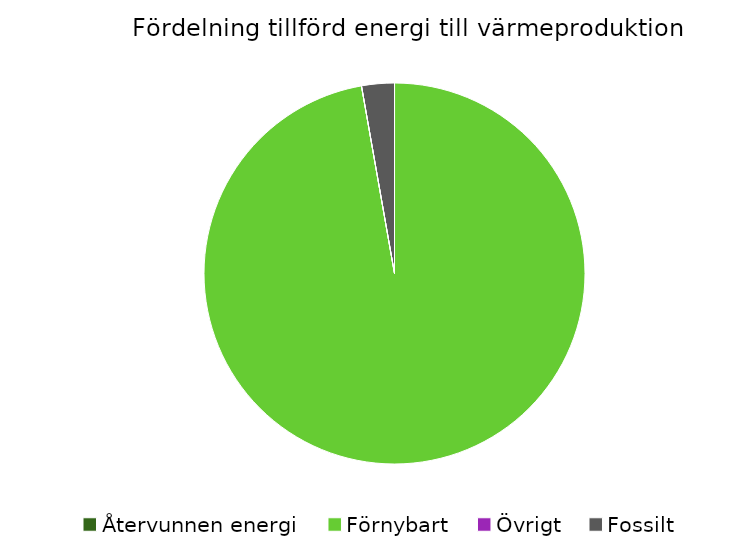
| Category | Fördelning värmeproduktion |
|---|---|
| Återvunnen energi | 0 |
| Förnybart | 0.972 |
| Övrigt | 0 |
| Fossilt | 0.028 |